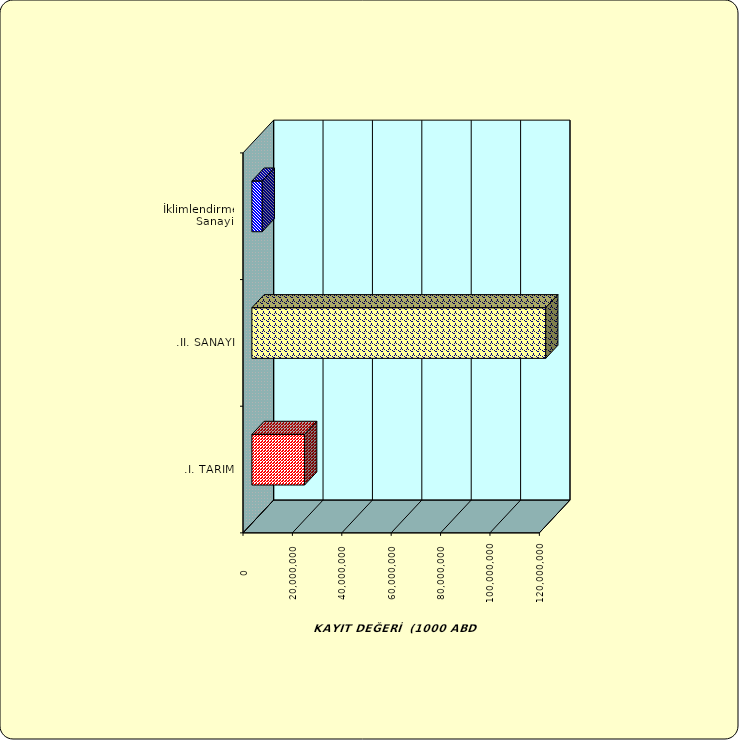
| Category | Series 0 |
|---|---|
| .I. TARIM | 21340372.044 |
| .II. SANAYİ | 118979593.696 |
|  İklimlendirme Sanayii | 4195938.149 |